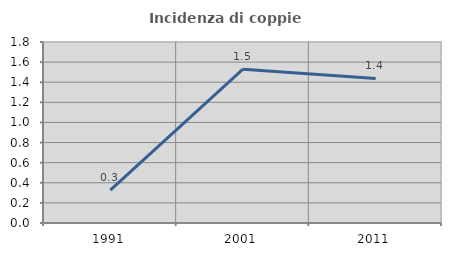
| Category | Incidenza di coppie miste |
|---|---|
| 1991.0 | 0.327 |
| 2001.0 | 1.53 |
| 2011.0 | 1.438 |